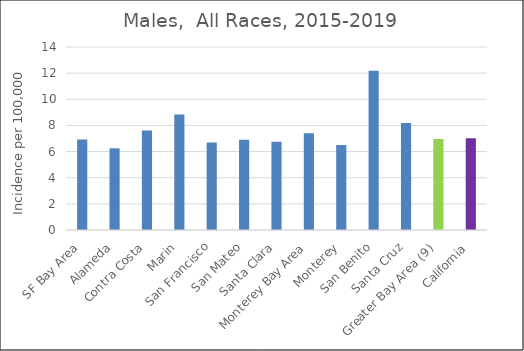
| Category | Male |
|---|---|
| SF Bay Area | 6.92 |
|   Alameda | 6.25 |
|   Contra Costa | 7.62 |
|   Marin | 8.84 |
|   San Francisco | 6.7 |
|   San Mateo | 6.91 |
|   Santa Clara | 6.75 |
| Monterey Bay Area | 7.41 |
|   Monterey | 6.5 |
|   San Benito | 12.19 |
|   Santa Cruz | 8.19 |
| Greater Bay Area (9) | 6.97 |
| California | 7.01 |